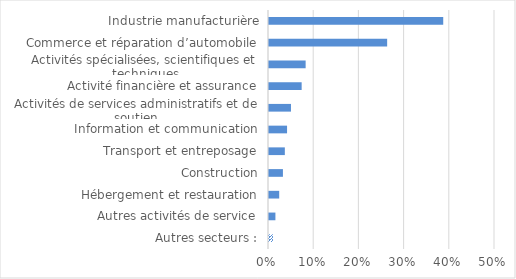
| Category | Series 0 |
|---|---|
| Autres secteurs : | 0.009 |
| Autres activités de service | 0.014 |
| Hébergement et restauration | 0.023 |
| Construction | 0.031 |
| Transport et entreposage | 0.035 |
| Information et communication | 0.04 |
| Activités de services administratifs et de soutien | 0.049 |
| Activité financière et assurance | 0.072 |
| Activités spécialisées, scientifiques et techniques | 0.081 |
| Commerce et réparation d’automobile | 0.261 |
| Industrie manufacturière | 0.385 |